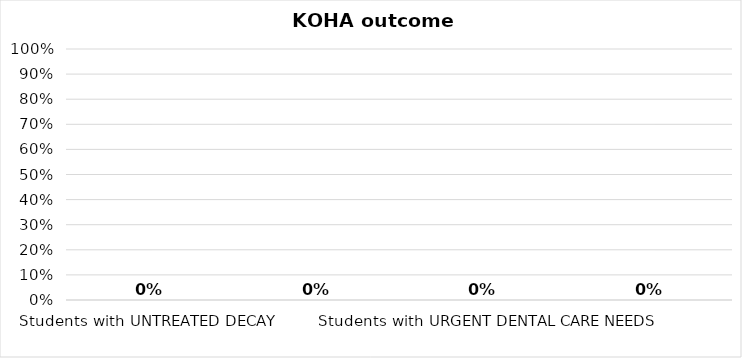
| Category | Series 0 |
|---|---|
| Students with UNTREATED DECAY  | 0 |
| Students with CARIES EXPERIENCE | 0 |
| Students with URGENT DENTAL CARE NEEDS | 0 |
| Students with urgent dental care needs who RECEIVED TREATMENT  | 0 |